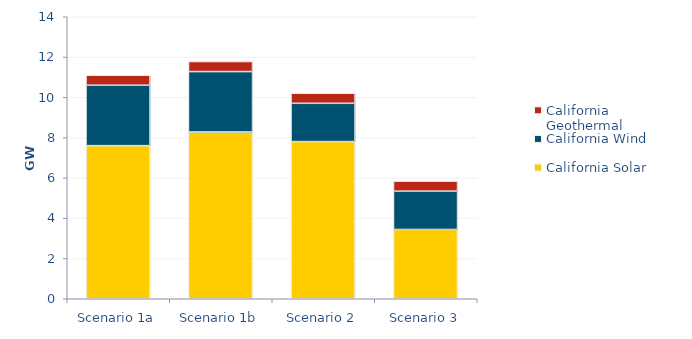
| Category | California Solar | California Wind | California Geothermal |
|---|---|---|---|
| Scenario 1a | 7600.748 | 3000 | 500 |
| Scenario 1b | 8278.748 | 3000 | 500 |
| Scenario 2 | 7803.748 | 1900 | 500 |
| Scenario 3 | 3439.634 | 1900 | 500 |